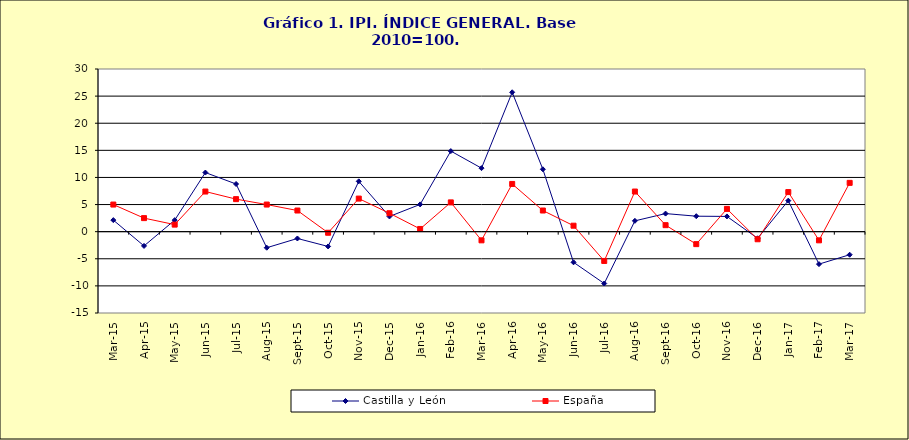
| Category | Castilla y León | España |
|---|---|---|
| 2015-03-03 | 2.131 | 5 |
| 2015-04-04 | -2.63 | 2.5 |
| 2015-05-05 | 2.125 | 1.3 |
| 2015-06-01 | 10.902 | 7.4 |
| 2015-07-02 | 8.793 | 6 |
| 2015-08-03 | -2.962 | 5 |
| 2015-09-04 | -1.256 | 3.9 |
| 2015-10-05 | -2.727 | -0.2 |
| 2015-11-06 | 9.284 | 6.1 |
| 2015-12-07 | 2.805 | 3.4 |
| 2016-01-01 | 5.027 | 0.5 |
| 2016-02-02 | 14.862 | 5.4 |
| 2016-03-03 | 11.716 | -1.6 |
| 2016-04-04 | 25.706 | 8.8 |
| 2016-05-05 | 11.507 | 3.9 |
| 2016-06-06 | -5.65 | 1.1 |
| 2016-07-07 | -9.559 | -5.4 |
| 2016-08-08 | 1.995 | 7.4 |
| 2016-09-09 | 3.335 | 1.2 |
| 2016-10-10 | 2.852 | -2.3 |
| 2016-11-11 | 2.812 | 4.2 |
| 2016-12-12 | -1.223 | -1.4 |
| 2017-01-12 | 5.716 | 7.3 |
| 2017-02-01 | -5.985 | -1.6 |
| 2017-03-02 | -4.253 | 9 |